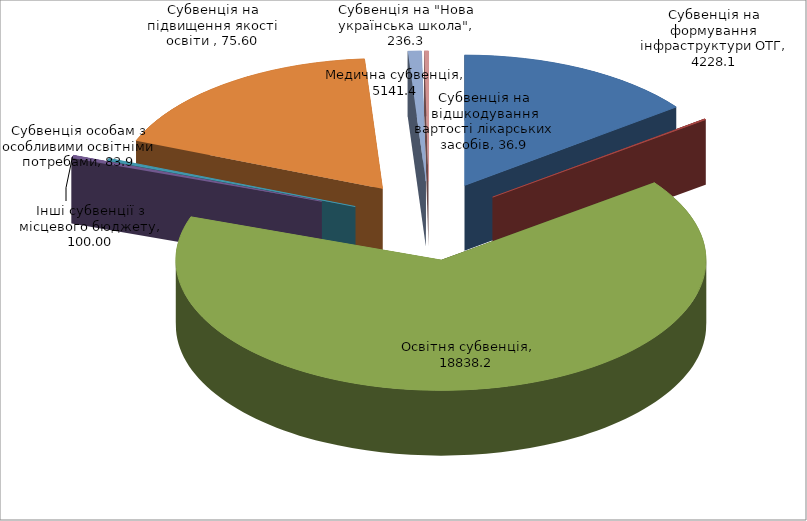
| Category | Series 0 |
|---|---|
| Субвенція на формування інфраструктури ОТГ | 4228.1 |
| Субвенція на відшкодування вартості лікарських засобів | 36.9 |
| Освітня субвенція | 18838.2 |
| Інші субвенції з місцевого бюджету | 100 |
| Субвенція особам з особливими освітніми потребами | 83.9 |
| Медична субвенція | 5141.4 |
| Субвенція на "Нова українська школа" | 236.3 |
| Субвенція на підвищення якості освіти  | 75.6 |